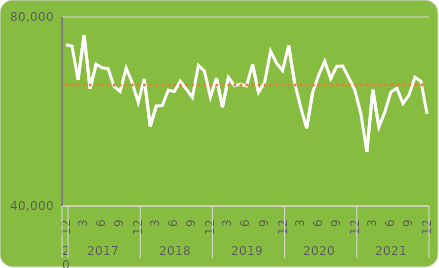
| Category | Som van Geregistreerde misdrijven | Som van Gemiddeld |
|---|---|---|
| 0 | 74113 | 65608.23 |
| 1 | 73839 | 65608.23 |
| 2 | 66691 | 65608.23 |
| 3 | 76148 | 65608.23 |
| 4 | 64852 | 65608.23 |
| 5 | 70027 | 65608.23 |
| 6 | 69264 | 65608.23 |
| 7 | 69037 | 65608.23 |
| 8 | 65288 | 65608.23 |
| 9 | 64231 | 65608.23 |
| 10 | 69184 | 65608.23 |
| 11 | 66112 | 65608.23 |
| 12 | 61930 | 65608.23 |
| 13 | 66900 | 65608.23 |
| 14 | 56854 | 65608.23 |
| 15 | 61153 | 65608.23 |
| 16 | 61261 | 65608.23 |
| 17 | 64525 | 65608.23 |
| 18 | 64238 | 65608.23 |
| 19 | 66406 | 65608.23 |
| 20 | 64730 | 65608.23 |
| 21 | 62994 | 65608.23 |
| 22 | 69749 | 65608.23 |
| 23 | 68591 | 65608.23 |
| 24 | 63029 | 65608.23 |
| 25 | 67098 | 65608.23 |
| 26 | 60918 | 65608.23 |
| 27 | 67209 | 65608.23 |
| 28 | 65456 | 65608.23 |
| 29 | 65808 | 65608.23 |
| 30 | 65403 | 65608.23 |
| 31 | 69994 | 65608.23 |
| 32 | 64039 | 65608.23 |
| 33 | 66065 | 65608.23 |
| 34 | 72780 | 65608.23 |
| 35 | 70217 | 65608.23 |
| 36 | 68661 | 65608.23 |
| 37 | 73964 | 65608.23 |
| 38 | 66085 | 65608.23 |
| 39 | 60931 | 65608.23 |
| 40 | 56462 | 65608.23 |
| 41 | 64080 | 65608.23 |
| 42 | 67704 | 65608.23 |
| 43 | 70633 | 65608.23 |
| 44 | 66956 | 65608.23 |
| 45 | 69577 | 65608.23 |
| 46 | 69616 | 65608.23 |
| 47 | 67114 | 65608.23 |
| 48 | 64531 | 65608.23 |
| 49 | 59599 | 65608.23 |
| 50 | 51512 | 65608.23 |
| 51 | 64607 | 65608.23 |
| 52 | 56697 | 65608.23 |
| 53 | 59897 | 65608.23 |
| 54 | 64122 | 65608.23 |
| 55 | 64943 | 65608.23 |
| 56 | 61690 | 65608.23 |
| 57 | 63455 | 65608.23 |
| 58 | 67245 | 65608.23 |
| 59 | 66390 | 65608.23 |
| 60 | 59498 | 65608.23 |